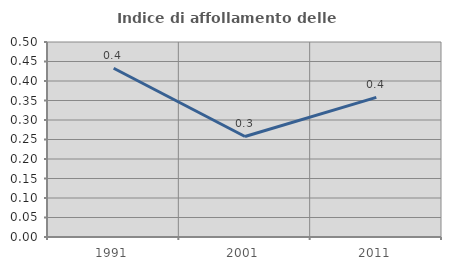
| Category | Indice di affollamento delle abitazioni  |
|---|---|
| 1991.0 | 0.433 |
| 2001.0 | 0.258 |
| 2011.0 | 0.358 |